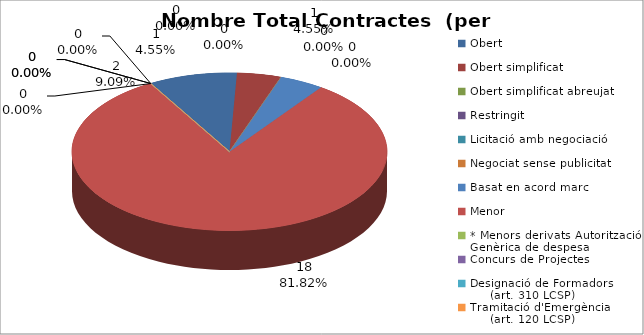
| Category | Nombre Total Contractes |
|---|---|
| Obert | 2 |
| Obert simplificat | 1 |
| Obert simplificat abreujat | 0 |
| Restringit | 0 |
| Licitació amb negociació | 0 |
| Negociat sense publicitat | 0 |
| Basat en acord marc | 1 |
| Menor | 18 |
| * Menors derivats Autorització Genèrica de despesa | 0 |
| Concurs de Projectes | 0 |
| Designació de Formadors
     (art. 310 LCSP) | 0 |
| Tramitació d'Emergència
     (art. 120 LCSP) | 0 |